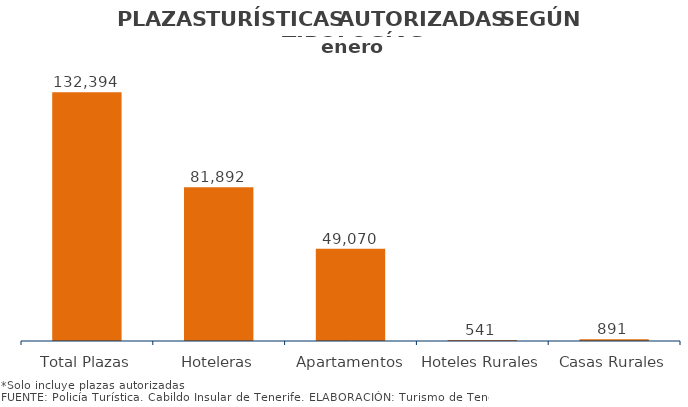
| Category | PLAZAS TURISTICAS AUTORIZADAS SEGÚN TIPOLOGÍA DEL ESTABLECIMIENTO.
Municipios e Isla enero 2014 |
|---|---|
| Total Plazas | 132394 |
| Hoteleras | 81892 |
| Apartamentos | 49070 |
| Hoteles Rurales | 541 |
| Casas Rurales | 891 |